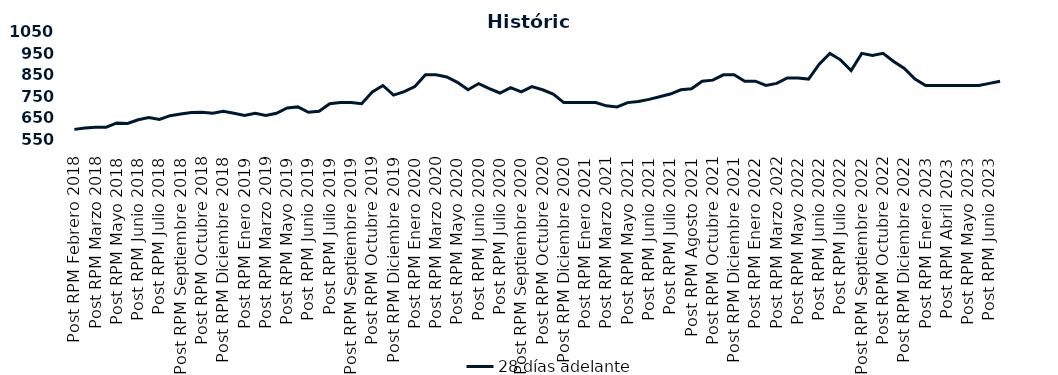
| Category | 28 días adelante |
|---|---|
| Post RPM Febrero 2018 | 595 |
| Pre RPM Marzo 2018 | 601 |
| Post RPM Marzo 2018 | 605 |
| Pre RPM Mayo 2018 | 605 |
| Post RPM Mayo 2018 | 625 |
| Pre RPM Junio 2018 | 623 |
| Post RPM Junio 2018 | 640 |
| Pre RPM Julio 2018 | 650 |
| Post RPM Julio 2018 | 641 |
| Pre RPM Septiembre 2018 | 659 |
| Post RPM Septiembre 2018 | 666.75 |
| Pre RPM Octubre 2018 | 674 |
| Post RPM Octubre 2018 | 675 |
| Pre RPM Diciembre 2018 | 670 |
| Post RPM Diciembre 2018 | 680 |
| Pre RPM Enero 2019 | 670 |
| Post RPM Enero 2019 | 660 |
| Pre RPM Marzo 2019 | 670 |
| Post RPM Marzo 2019 | 660 |
| Pre RPM Mayo 2019 | 670 |
| Post RPM Mayo 2019 | 695 |
| Pre RPM Junio 2019 | 700 |
| Post RPM Junio 2019 | 675 |
| Pre RPM Julio 2019 | 680 |
| Post RPM Julio 2019 | 715 |
| Pre RPM Septiembre 2019 | 720 |
| Post RPM Septiembre 2019 | 720 |
| Pre RPM Octubre 2019 | 715 |
| Post RPM Octubre 2019 | 770 |
| Pre RPM Diciembre 2019 | 800 |
| Post RPM Diciembre 2019 | 755 |
| Pre RPM Enero 2020 | 771 |
| Post RPM Enero 2020 | 795 |
| Pre RPM Marzo 2020 | 850 |
| Post RPM Marzo 2020 | 850 |
| Pre RPM Mayo 2020 | 840 |
| Post RPM Mayo 2020 | 815 |
| Pre RPM Junio 2020 | 780 |
| Post RPM Junio 2020 | 809 |
| Pre RPM Julio 2020 | 785.72 |
| Post RPM Julio 2020 | 765 |
| Pre RPM Septiembre 2020 | 790 |
| Post RPM Septiembre 2020 | 770 |
| Pre RPM Octubre 2020 | 795 |
| Post RPM Octubre 2020 | 780 |
| Pre RPM Diciembre 2020 | 760 |
| Post RPM Diciembre 2020 | 720 |
| Pre RPM Enero 2021 | 720 |
| Post RPM Enero 2021 | 720 |
| Pre RPM Marzo 2021 | 720 |
| Post RPM Marzo 2021 | 705 |
| Pre RPM Mayo 2021 | 700 |
| Post RPM Mayo 2021 | 720 |
| Pre RPM Junio 2021 | 725 |
| Post RPM Junio 2021 | 735 |
| Pre RPM Julio 2021 | 747.5 |
| Post RPM Julio 2021 | 760 |
| Pre RPM Agosto 2021 | 780 |
| Post RPM Agosto 2021 | 785 |
| Pre RPM Octubre 2021 | 820 |
| Post RPM Octubre 2021 | 825 |
| Pre RPM Diciembre 2021 | 850 |
| Post RPM Diciembre 2021 | 850 |
| Pre RPM Enero 2022 | 820 |
| Post RPM Enero 2022 | 820 |
| Pre RPM Marzo 2022 | 800 |
| Post RPM Marzo 2022 | 810 |
| Pre RPM Mayo 2022 | 835 |
| Post RPM Mayo 2022 | 835 |
| Pre RPM Junio 2022 | 830 |
| Post RPM Junio 2022 | 900 |
| Pre RPM Julio 2022 | 950 |
| Post RPM Julio 2022 | 920 |
| Pre RPM Septiembre 2022 | 870 |
| Post RPM Septiembre 2022 | 950 |
| Pre RPM Octubre 2022 | 940 |
| Post RPM Octubre 2022 | 950 |
| Pre RPM Diciembre 2022 | 912.5 |
| Post RPM Diciembre 2022 | 880 |
| Pre RPM Enero 2023 | 830 |
| Post RPM Enero 2023 | 800 |
| Pre RPM Abril 2023 | 800 |
| Post RPM Abril 2023 | 800 |
| Pre RPM Mayo 2023 | 800 |
| Post RPM Mayo 2023 | 800 |
| Pre RPM Junio 2023 | 800 |
| Post RPM Junio 2023 | 810 |
| Pre RPM Julio 2023 | 820 |